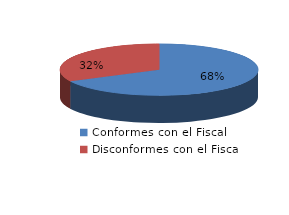
| Category | Series 0 |
|---|---|
| 0 | 1416 |
| 1 | 680 |